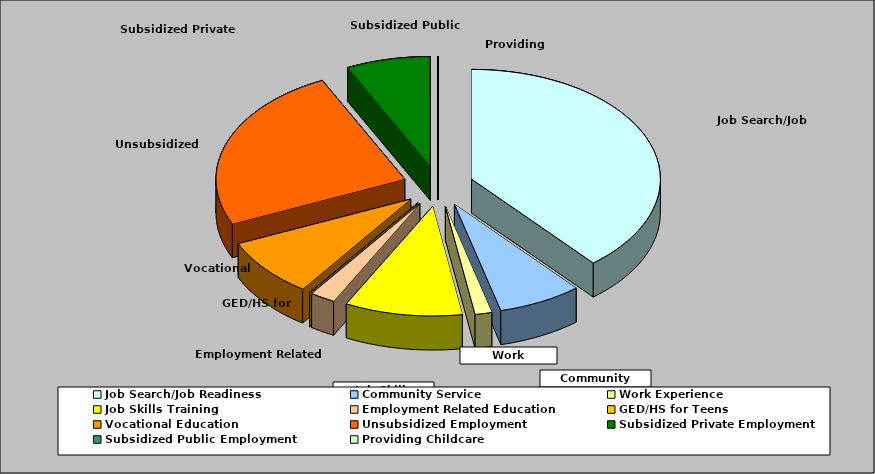
| Category | Series 0 |
|---|---|
| Job Search/Job Readiness | 0.388 |
| Community Service | 0.072 |
| Work Experience | 0.014 |
| Job Skills Training | 0.101 |
| Employment Related Education | 0.022 |
| GED/HS for Teens | 0 |
| Vocational Education | 0.086 |
| Unsubsidized Employment | 0.245 |
| Subsidized Private Employment | 0.072 |
| Subsidized Public Employment | 0 |
| Providing Childcare | 0 |